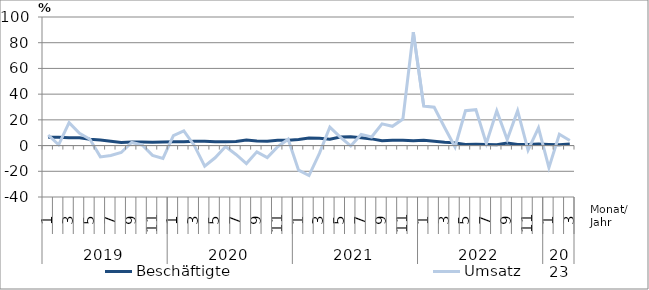
| Category | Beschäftigte | Umsatz |
|---|---|---|
| 0 | 6.4 | 8.2 |
| 1 | 6.5 | 0.6 |
| 2 | 6 | 17.8 |
| 3 | 6.1 | 9.6 |
| 4 | 4.9 | 4.9 |
| 5 | 4.3 | -8.8 |
| 6 | 3.3 | -7.7 |
| 7 | 2.4 | -5.4 |
| 8 | 2.8 | 2.4 |
| 9 | 2.7 | 0.5 |
| 10 | 2.5 | -7.6 |
| 11 | 2.7 | -10 |
| 12 | 2.9 | 7.8 |
| 13 | 2.9 | 11.5 |
| 14 | 3.4 | 0.1 |
| 15 | 3.4 | -16.1 |
| 16 | 2.9 | -9.5 |
| 17 | 2.9 | -0.8 |
| 18 | 3.1 | -6.9 |
| 19 | 4.3 | -14 |
| 20 | 3.6 | -4.9 |
| 21 | 3.4 | -9.4 |
| 22 | 4.1 | -0.9 |
| 23 | 4.1 | 4.9 |
| 24 | 4.8 | -19.1 |
| 25 | 5.8 | -23.3 |
| 26 | 5.6 | -6.1 |
| 27 | 5 | 14.4 |
| 28 | 6.6 | 6.6 |
| 29 | 6.9 | -0.3 |
| 30 | 6 | 8.7 |
| 31 | 5.2 | 6.7 |
| 32 | 3.8 | 16.9 |
| 33 | 4.2 | 15 |
| 34 | 4.2 | 20.6 |
| 35 | 3.7 | 88.1 |
| 36 | 4.1 | 30.7 |
| 37 | 3.4 | 29.8 |
| 38 | 2.6 | 14.1 |
| 39 | 2.1 | -1.1 |
| 40 | 0.9 | 27.1 |
| 41 | 1 | 27.9 |
| 42 | 0.8 | 1.7 |
| 43 | 0.7 | 27 |
| 44 | 2 | 4.7 |
| 45 | 0.9 | 27.1 |
| 46 | 0.9 | -3.5 |
| 47 | 1.3 | 13.7 |
| 48 | 0.9 | -17.2 |
| 49 | 0.6 | 8.8 |
| 50 | 1.2 | 4 |